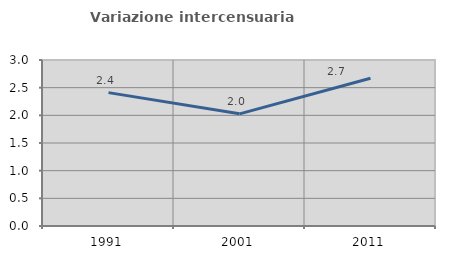
| Category | Variazione intercensuaria annua |
|---|---|
| 1991.0 | 2.41 |
| 2001.0 | 2.027 |
| 2011.0 | 2.669 |